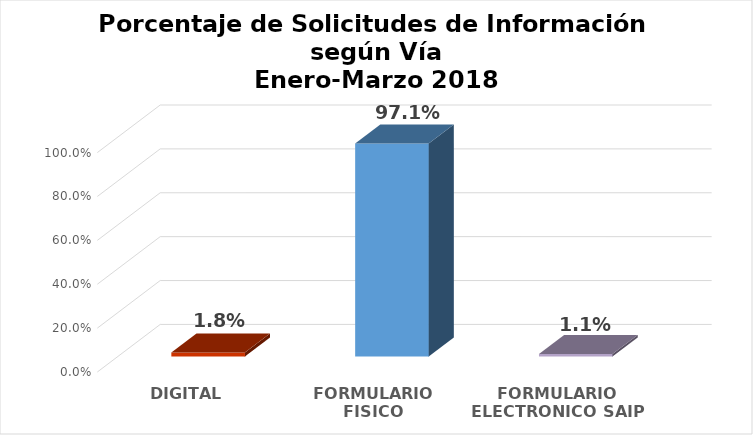
| Category | Series 0 |
|---|---|
| DIGITAL | 0.018 |
| FORMULARIO FISICO | 0.971 |
| FORMULARIO ELECTRONICO SAIP | 0.011 |